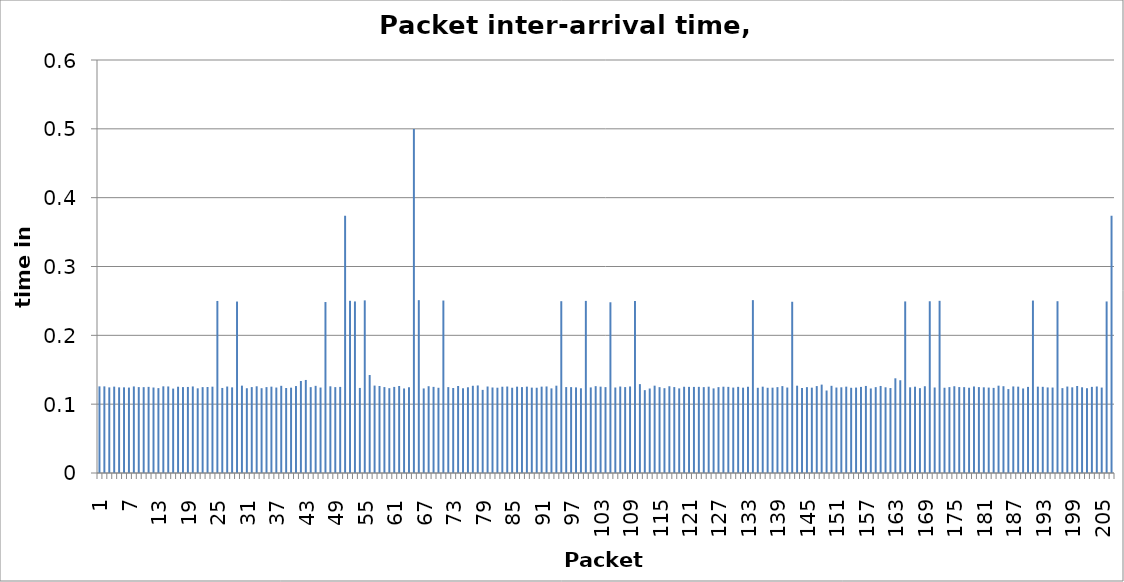
| Category | Packet inter-arrival time, 392(audio-board)-Meshlium |
|---|---|
| 1.0 | 0.126 |
| 2.0 | 0.126 |
| 3.0 | 0.124 |
| 4.0 | 0.125 |
| 5.0 | 0.124 |
| 6.0 | 0.124 |
| 7.0 | 0.124 |
| 8.0 | 0.126 |
| 9.0 | 0.125 |
| 10.0 | 0.125 |
| 11.0 | 0.125 |
| 12.0 | 0.124 |
| 13.0 | 0.123 |
| 14.0 | 0.126 |
| 15.0 | 0.126 |
| 16.0 | 0.123 |
| 17.0 | 0.125 |
| 18.0 | 0.125 |
| 19.0 | 0.125 |
| 20.0 | 0.126 |
| 21.0 | 0.123 |
| 22.0 | 0.125 |
| 23.0 | 0.125 |
| 24.0 | 0.125 |
| 25.0 | 0.25 |
| 26.0 | 0.124 |
| 27.0 | 0.126 |
| 28.0 | 0.124 |
| 29.0 | 0.249 |
| 30.0 | 0.127 |
| 31.0 | 0.123 |
| 32.0 | 0.125 |
| 33.0 | 0.126 |
| 34.0 | 0.123 |
| 35.0 | 0.125 |
| 36.0 | 0.125 |
| 37.0 | 0.124 |
| 38.0 | 0.127 |
| 39.0 | 0.123 |
| 40.0 | 0.124 |
| 41.0 | 0.126 |
| 42.0 | 0.134 |
| 43.0 | 0.135 |
| 44.0 | 0.125 |
| 45.0 | 0.127 |
| 46.0 | 0.124 |
| 47.0 | 0.248 |
| 48.0 | 0.126 |
| 49.0 | 0.125 |
| 50.0 | 0.125 |
| 51.0 | 0.374 |
| 52.0 | 0.25 |
| 53.0 | 0.249 |
| 54.0 | 0.124 |
| 55.0 | 0.251 |
| 56.0 | 0.142 |
| 57.0 | 0.127 |
| 58.0 | 0.126 |
| 59.0 | 0.125 |
| 60.0 | 0.123 |
| 61.0 | 0.125 |
| 62.0 | 0.126 |
| 63.0 | 0.123 |
| 64.0 | 0.125 |
| 65.0 | 0.5 |
| 66.0 | 0.251 |
| 67.0 | 0.123 |
| 68.0 | 0.126 |
| 69.0 | 0.125 |
| 70.0 | 0.124 |
| 71.0 | 0.251 |
| 72.0 | 0.125 |
| 73.0 | 0.123 |
| 74.0 | 0.126 |
| 75.0 | 0.123 |
| 76.0 | 0.125 |
| 77.0 | 0.127 |
| 78.0 | 0.127 |
| 79.0 | 0.121 |
| 80.0 | 0.126 |
| 81.0 | 0.124 |
| 82.0 | 0.124 |
| 83.0 | 0.125 |
| 84.0 | 0.126 |
| 85.0 | 0.124 |
| 86.0 | 0.125 |
| 87.0 | 0.125 |
| 88.0 | 0.125 |
| 89.0 | 0.124 |
| 90.0 | 0.124 |
| 91.0 | 0.125 |
| 92.0 | 0.126 |
| 93.0 | 0.123 |
| 94.0 | 0.127 |
| 95.0 | 0.25 |
| 96.0 | 0.125 |
| 97.0 | 0.125 |
| 98.0 | 0.124 |
| 99.0 | 0.123 |
| 100.0 | 0.25 |
| 101.0 | 0.124 |
| 102.0 | 0.126 |
| 103.0 | 0.125 |
| 104.0 | 0.125 |
| 105.0 | 0.248 |
| 106.0 | 0.124 |
| 107.0 | 0.126 |
| 108.0 | 0.125 |
| 109.0 | 0.126 |
| 110.0 | 0.25 |
| 111.0 | 0.129 |
| 112.0 | 0.12 |
| 113.0 | 0.123 |
| 114.0 | 0.127 |
| 115.0 | 0.125 |
| 116.0 | 0.123 |
| 117.0 | 0.126 |
| 118.0 | 0.125 |
| 119.0 | 0.123 |
| 120.0 | 0.125 |
| 121.0 | 0.125 |
| 122.0 | 0.125 |
| 123.0 | 0.125 |
| 124.0 | 0.125 |
| 125.0 | 0.125 |
| 126.0 | 0.123 |
| 127.0 | 0.125 |
| 128.0 | 0.125 |
| 129.0 | 0.125 |
| 130.0 | 0.124 |
| 131.0 | 0.125 |
| 132.0 | 0.124 |
| 133.0 | 0.125 |
| 134.0 | 0.251 |
| 135.0 | 0.124 |
| 136.0 | 0.125 |
| 137.0 | 0.124 |
| 138.0 | 0.124 |
| 139.0 | 0.125 |
| 140.0 | 0.126 |
| 141.0 | 0.124 |
| 142.0 | 0.249 |
| 143.0 | 0.127 |
| 144.0 | 0.124 |
| 145.0 | 0.125 |
| 146.0 | 0.124 |
| 147.0 | 0.126 |
| 148.0 | 0.128 |
| 149.0 | 0.12 |
| 150.0 | 0.127 |
| 151.0 | 0.124 |
| 152.0 | 0.124 |
| 153.0 | 0.125 |
| 154.0 | 0.124 |
| 155.0 | 0.124 |
| 156.0 | 0.125 |
| 157.0 | 0.126 |
| 158.0 | 0.123 |
| 159.0 | 0.125 |
| 160.0 | 0.126 |
| 161.0 | 0.125 |
| 162.0 | 0.123 |
| 163.0 | 0.138 |
| 164.0 | 0.135 |
| 165.0 | 0.249 |
| 166.0 | 0.124 |
| 167.0 | 0.125 |
| 168.0 | 0.123 |
| 169.0 | 0.126 |
| 170.0 | 0.25 |
| 171.0 | 0.124 |
| 172.0 | 0.25 |
| 173.0 | 0.124 |
| 174.0 | 0.125 |
| 175.0 | 0.126 |
| 176.0 | 0.125 |
| 177.0 | 0.125 |
| 178.0 | 0.124 |
| 179.0 | 0.126 |
| 180.0 | 0.125 |
| 181.0 | 0.124 |
| 182.0 | 0.124 |
| 183.0 | 0.124 |
| 184.0 | 0.127 |
| 185.0 | 0.126 |
| 186.0 | 0.122 |
| 187.0 | 0.126 |
| 188.0 | 0.125 |
| 189.0 | 0.123 |
| 190.0 | 0.125 |
| 191.0 | 0.251 |
| 192.0 | 0.125 |
| 193.0 | 0.125 |
| 194.0 | 0.124 |
| 195.0 | 0.124 |
| 196.0 | 0.25 |
| 197.0 | 0.123 |
| 198.0 | 0.126 |
| 199.0 | 0.124 |
| 200.0 | 0.126 |
| 201.0 | 0.125 |
| 202.0 | 0.123 |
| 203.0 | 0.125 |
| 204.0 | 0.126 |
| 205.0 | 0.124 |
| 206.0 | 0.249 |
| 207.0 | 0.374 |